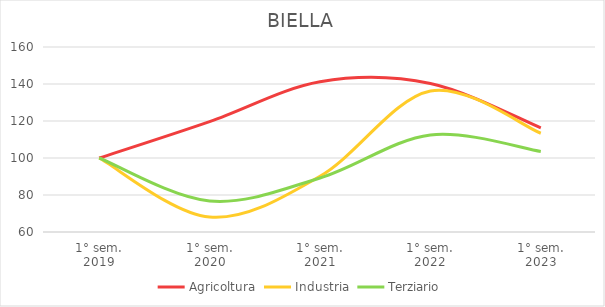
| Category | Agricoltura | Industria | Terziario |
|---|---|---|---|
| 1° sem.
2019 | 100 | 100 | 100 |
| 1° sem.
2020 | 119.692 | 68.079 | 76.745 |
| 1° sem.
2021 | 141.231 | 90.163 | 89.19 |
| 1° sem.
2022 | 140.308 | 136.236 | 112.445 |
| 1° sem.
2023 | 116.308 | 113.375 | 103.52 |